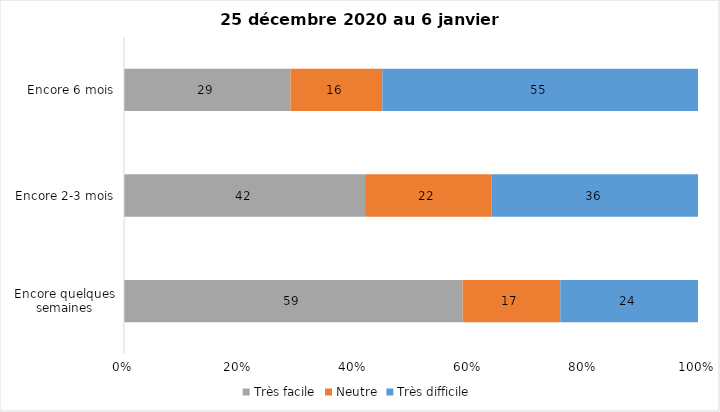
| Category | Très facile | Neutre | Très difficile |
|---|---|---|---|
| Encore quelques semaines | 59 | 17 | 24 |
| Encore 2-3 mois | 42 | 22 | 36 |
| Encore 6 mois | 29 | 16 | 55 |